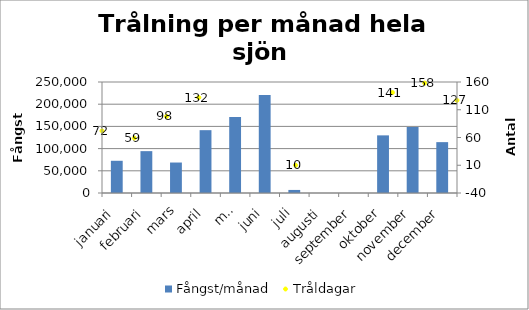
| Category | Fångst/månad |
|---|---|
| januari | 72551 |
| februari | 94268 |
| mars | 68631 |
| april | 141520 |
| maj | 171239 |
| juni | 220525 |
| juli | 6905 |
| augusti | 0 |
| september | 0 |
| oktober | 129805 |
| november | 148411 |
| december | 114557 |